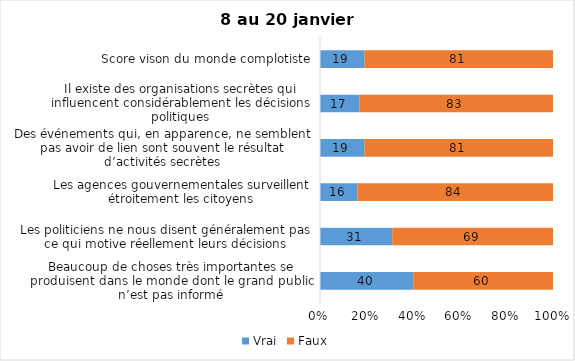
| Category | Vrai | Faux |
|---|---|---|
| Beaucoup de choses très importantes se produisent dans le monde dont le grand public n’est pas informé | 40 | 60 |
| Les politiciens ne nous disent généralement pas ce qui motive réellement leurs décisions | 31 | 69 |
| Les agences gouvernementales surveillent étroitement les citoyens | 16 | 84 |
| Des événements qui, en apparence, ne semblent pas avoir de lien sont souvent le résultat d’activités secrètes | 19 | 81 |
| Il existe des organisations secrètes qui influencent considérablement les décisions politiques | 17 | 83 |
| Score vison du monde complotiste | 19 | 81 |